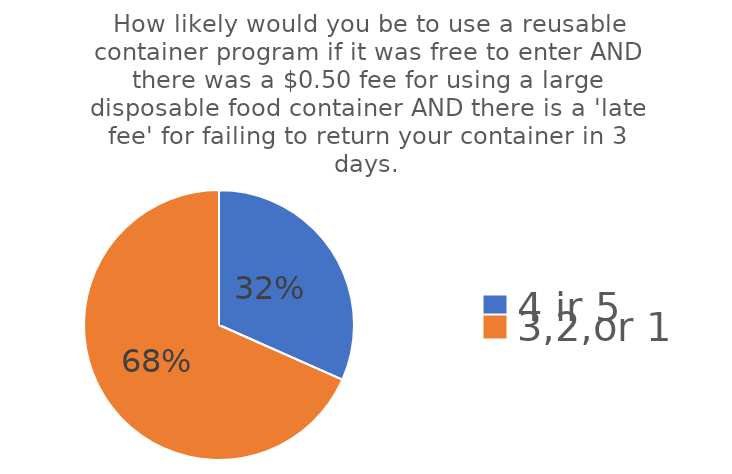
| Category | Series 0 |
|---|---|
| 4 ir 5 | 56 |
| 3,2,or 1 | 121 |